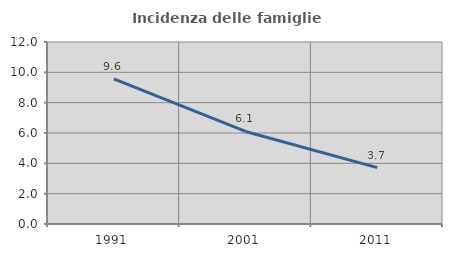
| Category | Incidenza delle famiglie numerose |
|---|---|
| 1991.0 | 9.574 |
| 2001.0 | 6.101 |
| 2011.0 | 3.718 |